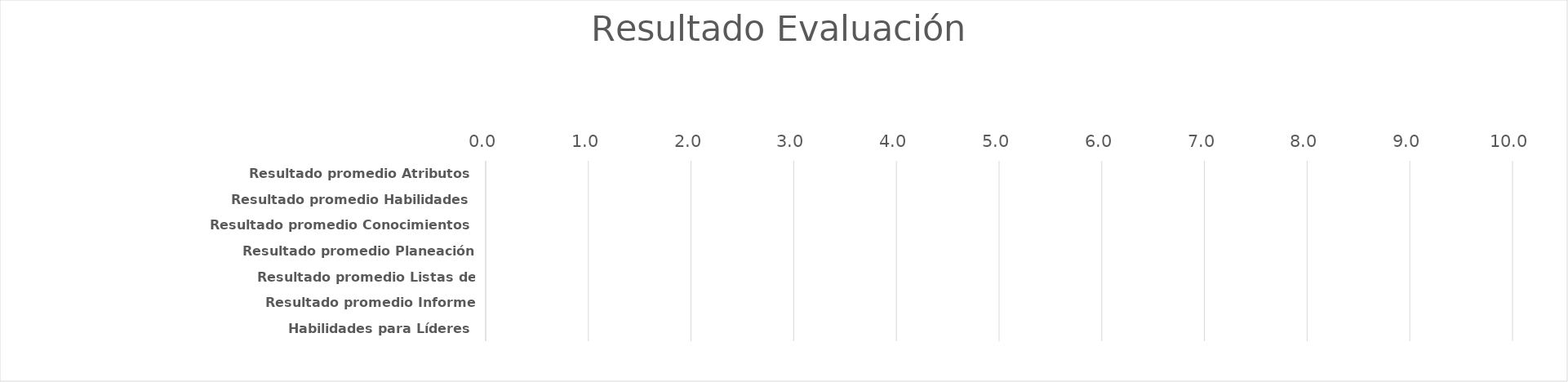
| Category | Resultado Evaluación |
|---|---|
| Resultado promedio Atributos | 0 |
| Resultado promedio Habilidades | 0 |
| Resultado promedio Conocimientos | 0 |
| Resultado promedio Planeación Auditoría | 0 |
| Resultado promedio Listas de Chequéo | 0 |
| Resultado promedio Informe Auditoría | 0 |
| Habilidades para Líderes | 0 |